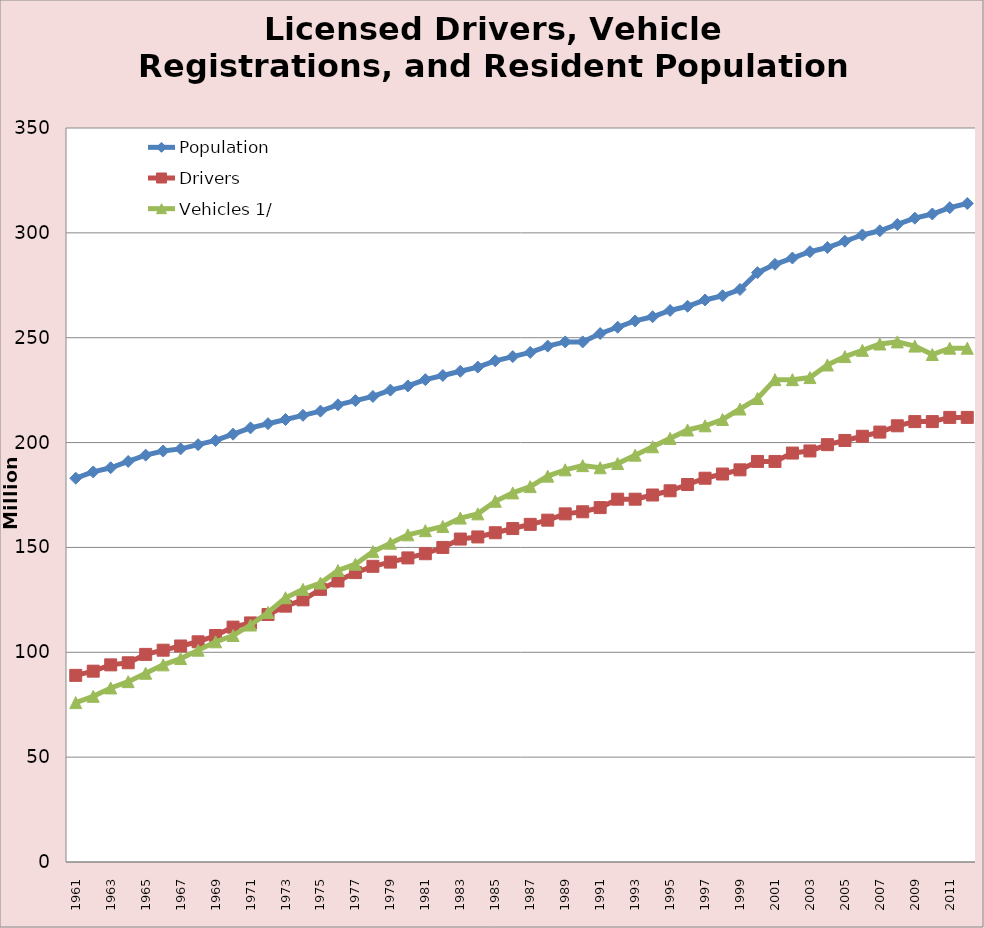
| Category | Population | Drivers  | Vehicles 1/ |
|---|---|---|---|
| 1961 | 183 | 89 | 76 |
| 1962 | 186 | 91 | 79 |
| 1963 | 188 | 94 | 83 |
| 1964 | 191 | 95 | 86 |
| 1965 | 194 | 99 | 90 |
| 1966 | 196 | 101 | 94 |
| 1967 | 197 | 103 | 97 |
| 1968 | 199 | 105 | 101 |
| 1969 | 201 | 108 | 105 |
| 1970 | 204 | 112 | 108 |
| 1971 | 207 | 114 | 113 |
| 1972 | 209 | 118 | 119 |
| 1973 | 211 | 122 | 126 |
| 1974 | 213 | 125 | 130 |
| 1975 | 215 | 130 | 133 |
| 1976 | 218 | 134 | 139 |
| 1977 | 220 | 138 | 142 |
| 1978 | 222 | 141 | 148 |
| 1979 | 225 | 143 | 152 |
| 1980 | 227 | 145 | 156 |
| 1981 | 230 | 147 | 158 |
| 1982 | 232 | 150 | 160 |
| 1983 | 234 | 154 | 164 |
| 1984 | 236 | 155 | 166 |
| 1985 | 239 | 157 | 172 |
| 1986 | 241 | 159 | 176 |
| 1987 | 243 | 161 | 179 |
| 1988 | 246 | 163 | 184 |
| 1989 | 248 | 166 | 187 |
| 1990 | 248 | 167 | 189 |
| 1991 | 252 | 169 | 188 |
| 1992 | 255 | 173 | 190 |
| 1993 | 258 | 173 | 194 |
| 1994 | 260 | 175 | 198 |
| 1995 | 263 | 177 | 202 |
| 1996 | 265 | 180 | 206 |
| 1997 | 268 | 183 | 208 |
| 1998 | 270 | 185 | 211 |
| 1999 | 273 | 187 | 216 |
| 2000 | 281 | 191 | 221 |
| 2001 | 285 | 191 | 230 |
| 2002 | 288 | 195 | 230 |
| 2003 | 291 | 196 | 231 |
| 2004 | 293 | 199 | 237 |
| 2005 | 296 | 201 | 241 |
| 2006 | 299 | 203 | 244 |
| 2007 | 301 | 205 | 247 |
| 2008 | 304 | 208 | 248 |
| 2009 | 307 | 210 | 246 |
| 2010 | 309 | 210 | 242 |
| 2011 | 312 | 212 | 245 |
| 2012 | 314 | 212 | 245 |